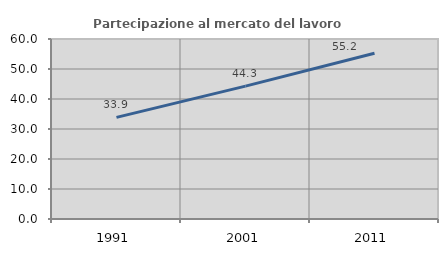
| Category | Partecipazione al mercato del lavoro  femminile |
|---|---|
| 1991.0 | 33.871 |
| 2001.0 | 44.286 |
| 2011.0 | 55.224 |